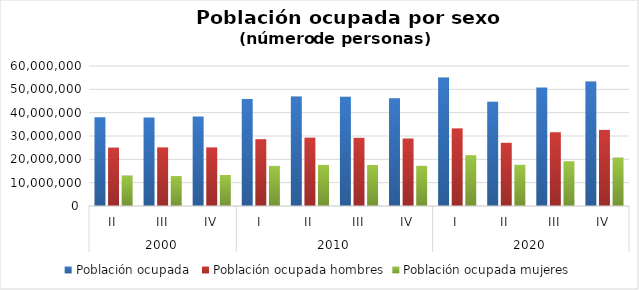
| Category | Población ocupada  | Población ocupada hombres | Población ocupada mujeres |
|---|---|---|---|
| 0 | 38044501 | 25014055 | 13030446 |
| 1 | 37970852 | 25127594 | 12843258 |
| 2 | 38410024 | 25128397 | 13281627 |
| 3 | 45818273 | 28636950 | 17181323 |
| 4 | 46890584 | 29279550 | 17611034 |
| 5 | 46772283 | 29210178 | 17562105 |
| 6 | 46143555 | 28935748 | 17207807 |
| 7 | 55058450 | 33275583 | 21782867 |
| 8 | 44715067.667 | 27075204.333 | 17639863.333 |
| 9 | 50810713 | 31620116 | 19190597 |
| 10 | 53331429 | 32605114 | 20726315 |